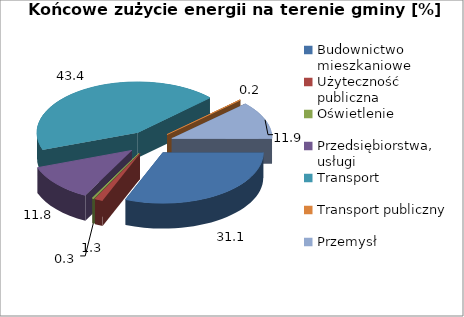
| Category | 31,1 1,3 0,3 11,8 43,4 0,2 11,9 |
|---|---|
| Budownictwo mieszkaniowe | 31.081 |
| Użyteczność publiczna | 1.311 |
| Oświetlenie | 0.286 |
| Przedsiębiorstwa, usługi | 11.792 |
| Transport | 43.429 |
| Transport publiczny | 0.165 |
| Przemysł | 11.936 |